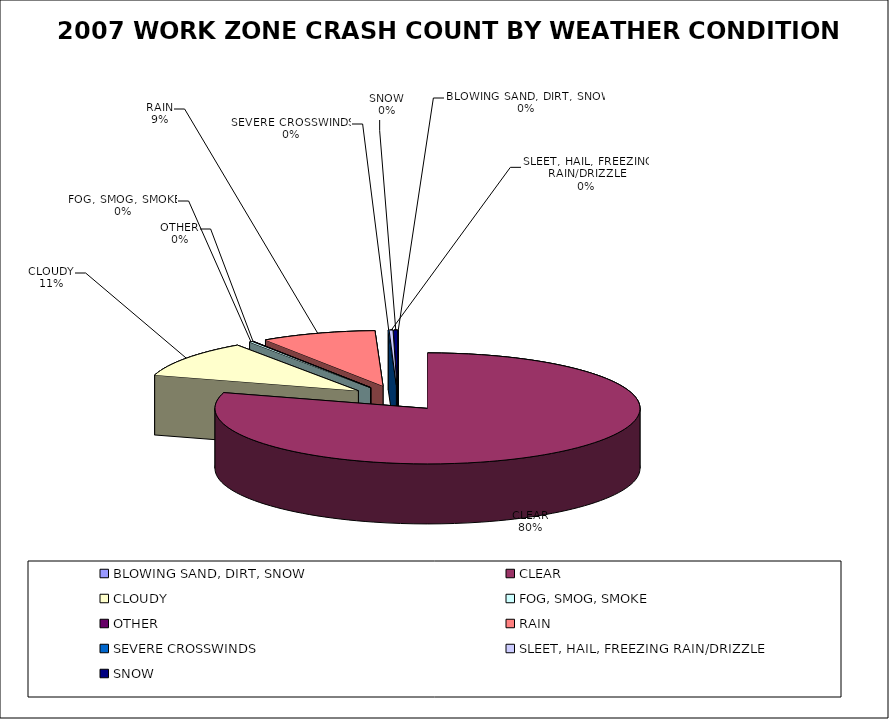
| Category | Series 0 | Series 1 |
|---|---|---|
| BLOWING SAND, DIRT, SNOW | 1 | 0 |
| CLEAR | 4980 | 0.796 |
| CLOUDY | 674 | 0.108 |
| FOG, SMOG, SMOKE | 16 | 0.003 |
| OTHER | 3 | 0 |
| RAIN | 546 | 0.087 |
| SEVERE CROSSWINDS | 4 | 0.001 |
| SLEET, HAIL, FREEZING RAIN/DRIZZLE | 16 | 0.003 |
| SNOW | 18 | 0.003 |